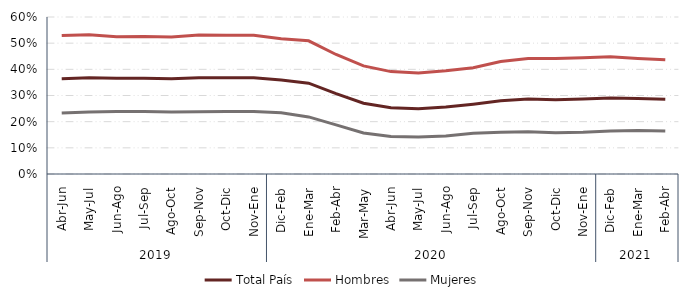
| Category | Total País | Hombres | Mujeres |
|---|---|---|---|
| 0 | 0.364 | 0.529 | 0.233 |
| 1 | 0.368 | 0.532 | 0.237 |
| 2 | 0.366 | 0.525 | 0.239 |
| 3 | 0.366 | 0.526 | 0.239 |
| 4 | 0.364 | 0.523 | 0.237 |
| 5 | 0.368 | 0.531 | 0.237 |
| 6 | 0.368 | 0.53 | 0.239 |
| 7 | 0.368 | 0.53 | 0.239 |
| 8 | 0.359 | 0.517 | 0.234 |
| 9 | 0.347 | 0.509 | 0.218 |
| 10 | 0.307 | 0.457 | 0.188 |
| 11 | 0.271 | 0.413 | 0.157 |
| 12 | 0.253 | 0.391 | 0.143 |
| 13 | 0.25 | 0.386 | 0.141 |
| 14 | 0.256 | 0.395 | 0.145 |
| 15 | 0.267 | 0.406 | 0.156 |
| 16 | 0.28 | 0.43 | 0.16 |
| 17 | 0.286 | 0.442 | 0.162 |
| 18 | 0.284 | 0.442 | 0.158 |
| 19 | 0.286 | 0.444 | 0.16 |
| 20 | 0.29 | 0.448 | 0.164 |
| 21 | 0.289 | 0.442 | 0.166 |
| 22 | 0.286 | 0.436 | 0.164 |